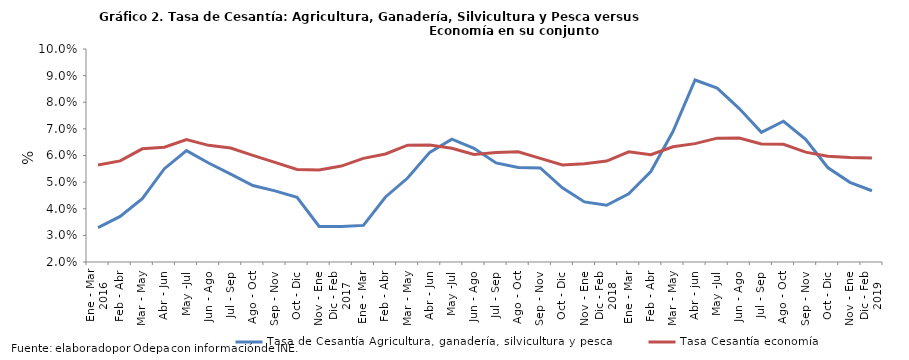
| Category | Tasa de Cesantía Agricultura, ganadería, silvicultura y pesca |
|---|---|
| 0 | 0.033 |
| 1 | 0.037 |
| 2 | 0.044 |
| 3 | 0.055 |
| 4 | 0.062 |
| 5 | 0.057 |
| 6 | 0.053 |
| 7 | 0.049 |
| 8 | 0.047 |
| 9 | 0.044 |
| 10 | 0.033 |
| 11 | 0.033 |
| 12 | 0.034 |
| 13 | 0.044 |
| 14 | 0.052 |
| 15 | 0.061 |
| 16 | 0.066 |
| 17 | 0.063 |
| 18 | 0.057 |
| 19 | 0.055 |
| 20 | 0.055 |
| 21 | 0.048 |
| 22 | 0.043 |
| 23 | 0.041 |
| 24 | 0.046 |
| 25 | 0.054 |
| 26 | 0.069 |
| 27 | 0.088 |
| 28 | 0.085 |
| 29 | 0.078 |
| 30 | 0.069 |
| 31 | 0.073 |
| 32 | 0.066 |
| 33 | 0.055 |
| 34 | 0.05 |
| 35 | 0.047 |